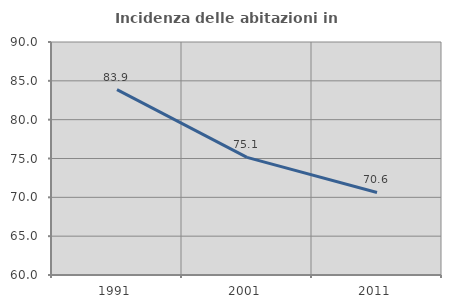
| Category | Incidenza delle abitazioni in proprietà  |
|---|---|
| 1991.0 | 83.876 |
| 2001.0 | 75.142 |
| 2011.0 | 70.625 |